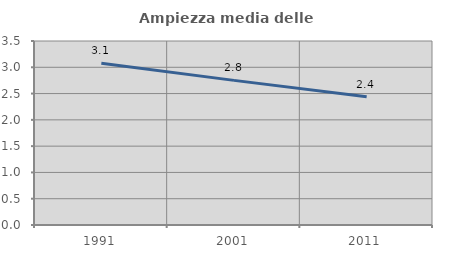
| Category | Ampiezza media delle famiglie |
|---|---|
| 1991.0 | 3.075 |
| 2001.0 | 2.751 |
| 2011.0 | 2.438 |